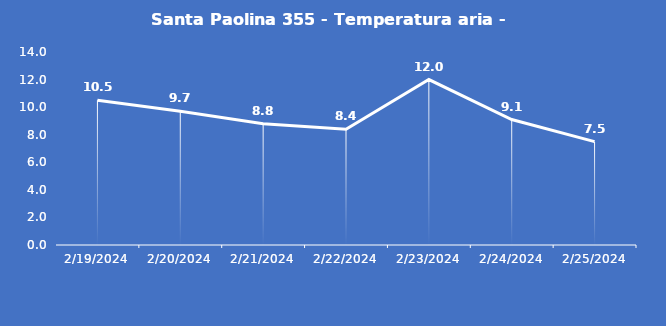
| Category | Santa Paolina 355 - Temperatura aria - Grezzo (°C) |
|---|---|
| 2/19/24 | 10.5 |
| 2/20/24 | 9.7 |
| 2/21/24 | 8.8 |
| 2/22/24 | 8.4 |
| 2/23/24 | 12 |
| 2/24/24 | 9.1 |
| 2/25/24 | 7.5 |